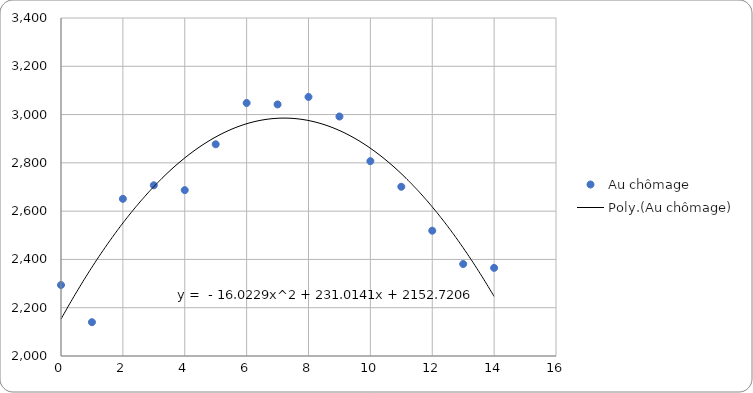
| Category | Au chômage |
|---|---|
| 0.0 | 2294 |
| 1.0 | 2140 |
| 2.0 | 2651 |
| 3.0 | 2707 |
| 4.0 | 2687 |
| 5.0 | 2877 |
| 6.0 | 3048 |
| 7.0 | 3042 |
| 8.0 | 3073 |
| 9.0 | 2992 |
| 10.0 | 2807 |
| 11.0 | 2701 |
| 12.0 | 2519 |
| 13.0 | 2381 |
| 14.0 | 2365 |